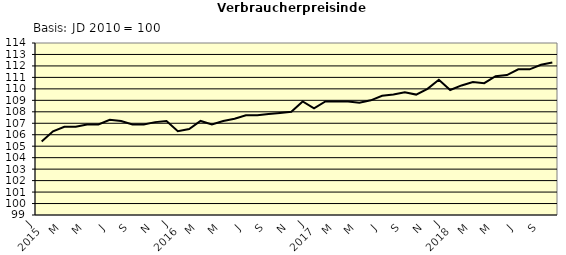
| Category | Series 0 |
|---|---|
| 0 | 105.4 |
| 1 | 106.3 |
| 2 | 106.7 |
| 3 | 106.7 |
| 4 | 106.9 |
| 5 | 106.9 |
| 6 | 107.3 |
| 7 | 107.2 |
| 8 | 106.9 |
| 9 | 106.9 |
| 10 | 107.1 |
| 11 | 107.2 |
| 12 | 106.3 |
| 13 | 106.5 |
| 14 | 107.2 |
| 15 | 106.9 |
| 16 | 107.2 |
| 17 | 107.4 |
| 18 | 107.7 |
| 19 | 107.7 |
| 20 | 107.8 |
| 21 | 107.9 |
| 22 | 108 |
| 23 | 108.9 |
| 24 | 108.3 |
| 25 | 108.9 |
| 26 | 108.9 |
| 27 | 108.9 |
| 28 | 108.8 |
| 29 | 109 |
| 30 | 109.4 |
| 31 | 109.5 |
| 32 | 109.7 |
| 33 | 109.5 |
| 34 | 110 |
| 35 | 110.8 |
| 36 | 109.9 |
| 37 | 110.3 |
| 38 | 110.6 |
| 39 | 110.5 |
| 40 | 111.1 |
| 41 | 111.2 |
| 42 | 111.7 |
| 43 | 111.7 |
| 44 | 112.1 |
| 45 | 112.3 |